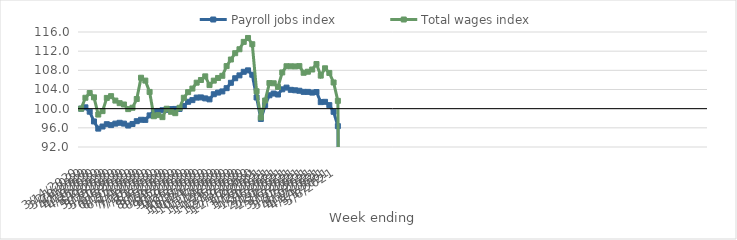
| Category | Payroll jobs index | Total wages index |
|---|---|---|
| 14/03/2020 | 100 | 100 |
| 21/03/2020 | 100.282 | 102.272 |
| 28/03/2020 | 99.37 | 103.26 |
| 04/04/2020 | 97.331 | 102.362 |
| 11/04/2020 | 95.837 | 98.77 |
| 18/04/2020 | 96.274 | 99.49 |
| 25/04/2020 | 96.759 | 102.24 |
| 02/05/2020 | 96.566 | 102.612 |
| 09/05/2020 | 96.881 | 101.685 |
| 16/05/2020 | 97.053 | 101.15 |
| 23/05/2020 | 96.879 | 100.874 |
| 30/05/2020 | 96.479 | 99.906 |
| 06/06/2020 | 96.805 | 100.192 |
| 13/06/2020 | 97.387 | 102.016 |
| 20/06/2020 | 97.681 | 106.458 |
| 27/06/2020 | 97.655 | 105.858 |
| 04/07/2020 | 98.597 | 103.492 |
| 11/07/2020 | 99.472 | 98.42 |
| 18/07/2020 | 99.526 | 98.657 |
| 25/07/2020 | 99.665 | 98.234 |
| 01/08/2020 | 99.759 | 99.988 |
| 08/08/2020 | 99.91 | 99.35 |
| 15/08/2020 | 99.946 | 99.057 |
| 22/08/2020 | 99.94 | 100.182 |
| 29/08/2020 | 100.553 | 102.275 |
| 05/09/2020 | 101.437 | 103.454 |
| 12/09/2020 | 101.784 | 104.195 |
| 19/09/2020 | 102.311 | 105.423 |
| 26/09/2020 | 102.348 | 105.986 |
| 03/10/2020 | 102.144 | 106.745 |
| 10/10/2020 | 101.942 | 104.923 |
| 17/10/2020 | 103.014 | 105.85 |
| 24/10/2020 | 103.357 | 106.409 |
| 31/10/2020 | 103.599 | 106.863 |
| 07/11/2020 | 104.278 | 108.888 |
| 14/11/2020 | 105.396 | 110.256 |
| 21/11/2020 | 106.35 | 111.576 |
| 28/11/2020 | 106.946 | 112.403 |
| 05/12/2020 | 107.692 | 113.935 |
| 12/12/2020 | 107.995 | 114.754 |
| 19/12/2020 | 107.076 | 113.449 |
| 26/12/2020 | 102.331 | 103.63 |
| 02/01/2021 | 97.855 | 98.15 |
| 09/01/2021 | 100.749 | 101.699 |
| 16/01/2021 | 102.795 | 105.35 |
| 23/01/2021 | 103.155 | 105.298 |
| 30/01/2021 | 102.952 | 104.523 |
| 06/02/2021 | 104.038 | 107.559 |
| 13/02/2021 | 104.397 | 108.856 |
| 20/02/2021 | 103.934 | 108.842 |
| 27/02/2021 | 103.834 | 108.818 |
| 06/03/2021 | 103.736 | 108.884 |
| 13/03/2021 | 103.506 | 107.491 |
| 20/03/2021 | 103.501 | 107.711 |
| 27/03/2021 | 103.352 | 108.172 |
| 03/04/2021 | 103.475 | 109.315 |
| 10/04/2021 | 101.367 | 106.895 |
| 17/04/2021 | 101.428 | 108.425 |
| 24/04/2021 | 100.738 | 107.455 |
| 01/05/2021 | 99.345 | 105.464 |
| 08/05/2021 | 96.359 | 101.632 |